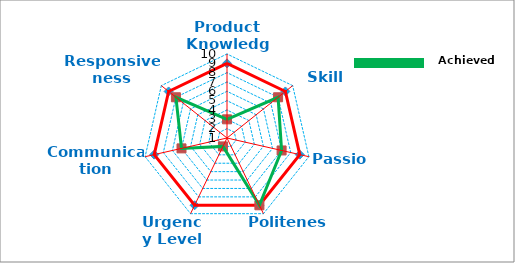
| Category | Target | Score Achieved |
|---|---|---|
| Product Knowledge | 9 | 3 |
| Skill Set | 9 | 8 |
| Passion | 9 | 7 |
| Politeness | 9 | 9 |
| Urgency Level | 9 | 2 |
| Communication | 9 | 6 |
| Responsiveness | 9 | 8 |